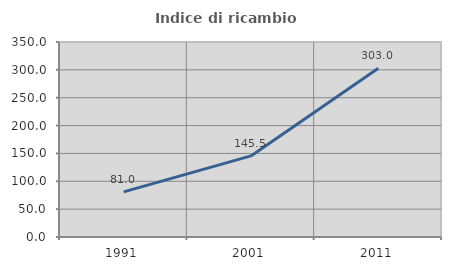
| Category | Indice di ricambio occupazionale  |
|---|---|
| 1991.0 | 80.992 |
| 2001.0 | 145.531 |
| 2011.0 | 302.96 |